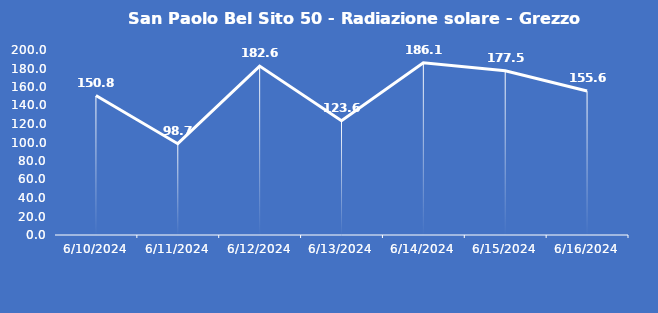
| Category | San Paolo Bel Sito 50 - Radiazione solare - Grezzo (W/m2) |
|---|---|
| 6/10/24 | 150.8 |
| 6/11/24 | 98.7 |
| 6/12/24 | 182.6 |
| 6/13/24 | 123.6 |
| 6/14/24 | 186.1 |
| 6/15/24 | 177.5 |
| 6/16/24 | 155.6 |